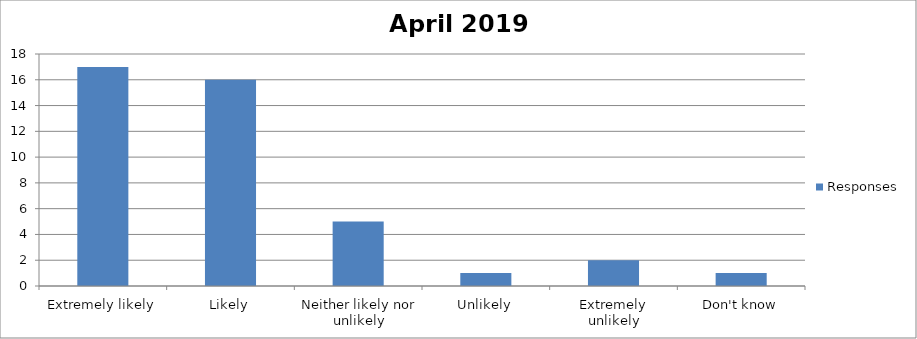
| Category | Responses |
|---|---|
| Extremely likely | 17 |
| Likely | 16 |
| Neither likely nor unlikely | 5 |
| Unlikely | 1 |
| Extremely unlikely | 2 |
| Don't know | 1 |